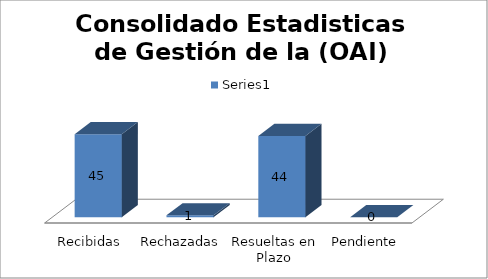
| Category | Series 0 |
|---|---|
| Recibidas | 45 |
| Rechazadas | 1 |
| Resueltas en Plazo | 44 |
| Pendiente | 0 |